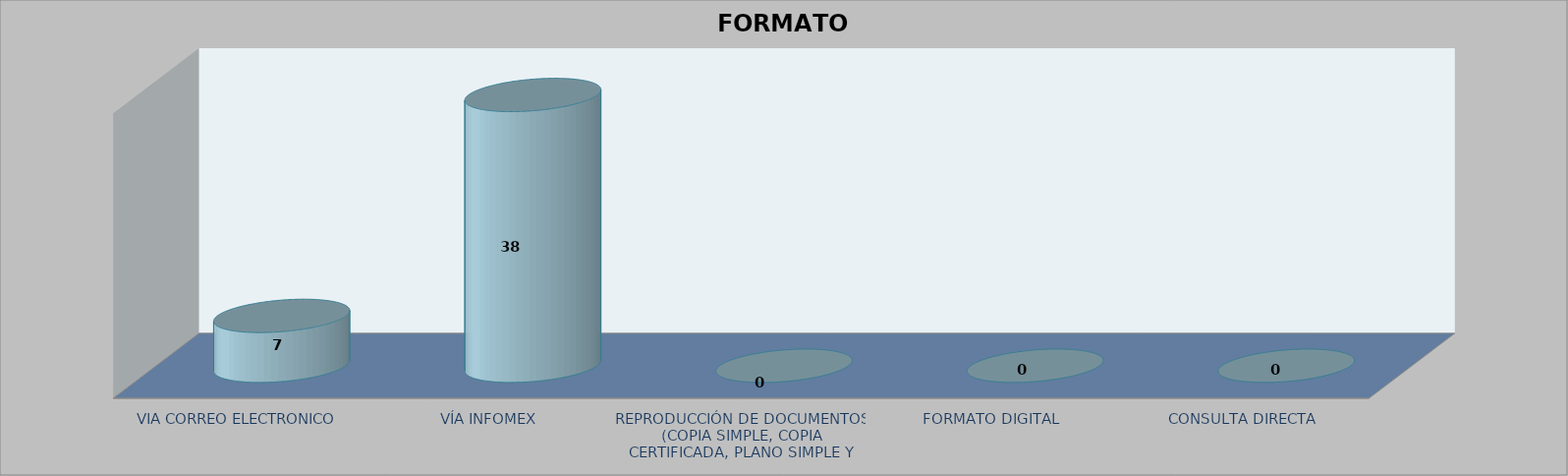
| Category |        FORMATO SOLICITADO | Series 1 | Series 2 |
|---|---|---|---|
| VIA CORREO ELECTRONICO |  |  | 7 |
| VÍA INFOMEX |  |  | 38 |
| REPRODUCCIÓN DE DOCUMENTOS (COPIA SIMPLE, COPIA CERTIFICADA, PLANO SIMPLE Y PLANO CERTIFICADO) |  |  | 0 |
| FORMATO DIGITAL |  |  | 0 |
| CONSULTA DIRECTA |  |  | 0 |